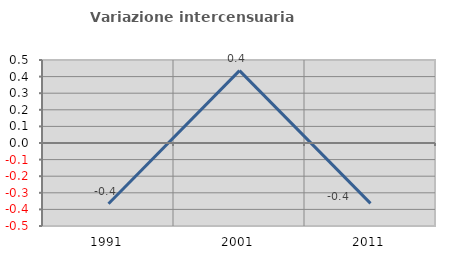
| Category | Variazione intercensuaria annua |
|---|---|
| 1991.0 | -0.366 |
| 2001.0 | 0.436 |
| 2011.0 | -0.364 |